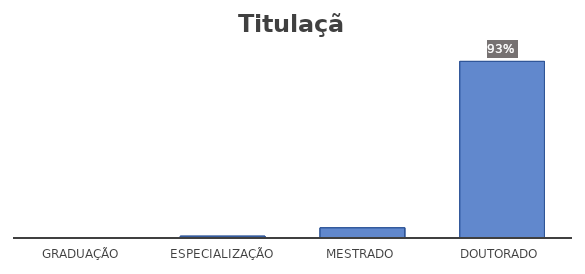
| Category | Series 0 |
|---|---|
| Graduação | 0.002 |
| Especialização | 0.009 |
| Mestrado | 0.054 |
| Doutorado | 0.934 |